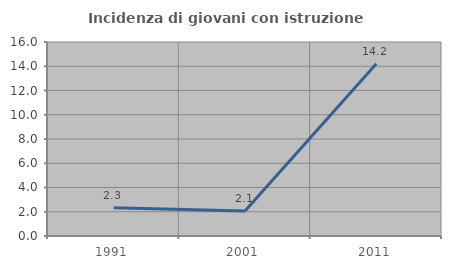
| Category | Incidenza di giovani con istruzione universitaria |
|---|---|
| 1991.0 | 2.326 |
| 2001.0 | 2.058 |
| 2011.0 | 14.213 |